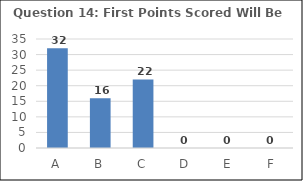
| Category | Series 0 |
|---|---|
| A | 32 |
| B | 16 |
| C | 22 |
| D | 0 |
| E | 0 |
| F | 0 |